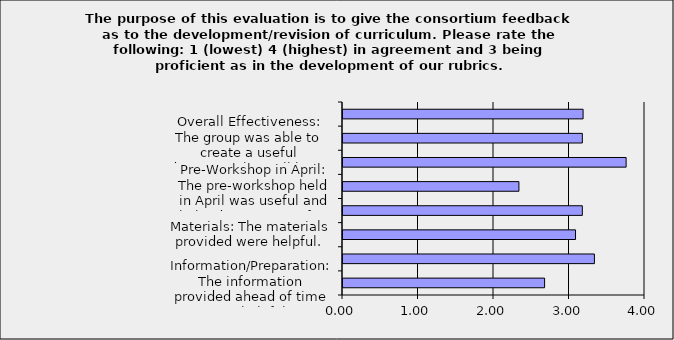
| Category | Series 0 |
|---|---|
| Information/Preparation: The information provided ahead of time was helpful. | 2.67 |
| Information/Preparation: The information given throughout the workshop was helpful. | 3.33 |
| Materials: The materials provided were helpful. | 3.08 |
| Understanding of Measurement Topics: I was able to understand the measurement topics and feel comfortable discussing them with peers. | 3.17 |
| Pre-Workshop in April: The pre-workshop held in April was useful and helped me prepare for my curriculum work in August. | 2.33 |
| Professional Development: The ability to work with others in my curricular area was beneficial. | 3.75 |
| Overall Effectiveness: The group was able to create a useful document that will have an impact on student success. | 3.17 |
| Timing of the Workshop: The timing of the workshop was effective. (I.e. Duration, calendar) | 3.18 |